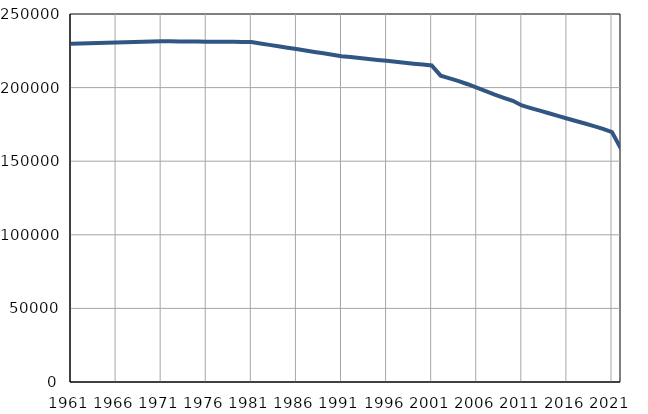
| Category | Population
size |
|---|---|
| 1961.0 | 229812 |
| 1962.0 | 229979 |
| 1963.0 | 230147 |
| 1964.0 | 230314 |
| 1965.0 | 230482 |
| 1966.0 | 230649 |
| 1967.0 | 230816 |
| 1968.0 | 230984 |
| 1969.0 | 231151 |
| 1970.0 | 231319 |
| 1971.0 | 231486 |
| 1972.0 | 231434 |
| 1973.0 | 231381 |
| 1974.0 | 231329 |
| 1975.0 | 231276 |
| 1976.0 | 231224 |
| 1977.0 | 231172 |
| 1978.0 | 231119 |
| 1979.0 | 231067 |
| 1980.0 | 231014 |
| 1981.0 | 230962 |
| 1982.0 | 230001 |
| 1983.0 | 229040 |
| 1984.0 | 228079 |
| 1985.0 | 227118 |
| 1986.0 | 226158 |
| 1987.0 | 225197 |
| 1988.0 | 224236 |
| 1989.0 | 223275 |
| 1990.0 | 222314 |
| 1991.0 | 221353 |
| 1992.0 | 220718 |
| 1993.0 | 220083 |
| 1994.0 | 219447 |
| 1995.0 | 218812 |
| 1996.0 | 218177 |
| 1997.0 | 217542 |
| 1998.0 | 216907 |
| 1999.0 | 216271 |
| 2000.0 | 215636 |
| 2001.0 | 215001 |
| 2002.0 | 208103 |
| 2003.0 | 206278 |
| 2004.0 | 204382 |
| 2005.0 | 202286 |
| 2006.0 | 199999 |
| 2007.0 | 197585 |
| 2008.0 | 195190 |
| 2009.0 | 193067 |
| 2010.0 | 191031 |
| 2011.0 | 187860 |
| 2012.0 | 186013 |
| 2013.0 | 184311 |
| 2014.0 | 182555 |
| 2015.0 | 180772 |
| 2016.0 | 178995 |
| 2017.0 | 177308 |
| 2018.0 | 175623 |
| 2019.0 | 173873 |
| 2020.0 | 171988 |
| 2021.0 | 169757 |
| 2022.0 | 158367 |